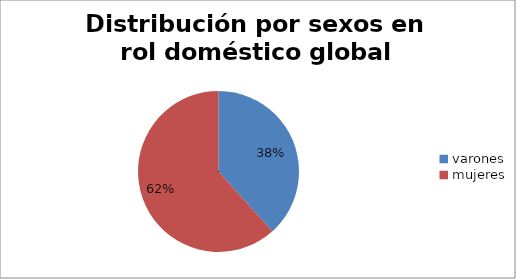
| Category | roles domesticos |
|---|---|
| varones | 230 |
| mujeres | 370 |